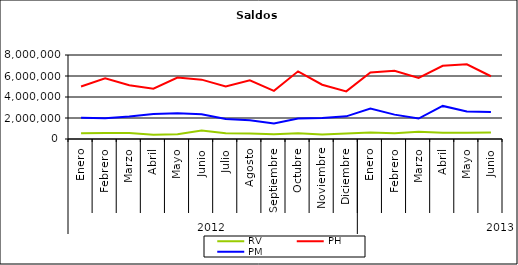
| Category | RV | PH | PM |
|---|---|---|---|
| 0 | 549778.168 | 5006132.96 | 2027838.04 |
| 1 | 570527.999 | 5771155.703 | 1979807.811 |
| 2 | 560604.832 | 5123876.98 | 2144060.858 |
| 3 | 406794.423 | 4795437.398 | 2380409.171 |
| 4 | 462649.26 | 5850616.083 | 2461213.349 |
| 5 | 809983.459 | 5653357.045 | 2353480.477 |
| 6 | 546190.07 | 4994057.097 | 1898309.443 |
| 7 | 522567.991 | 5588479.785 | 1784429.37 |
| 8 | 448289.909 | 4586134.432 | 1485313.653 |
| 9 | 545363.306 | 6443891.409 | 1946986.634 |
| 10 | 423789.041 | 5166977.96 | 1999930.741 |
| 11 | 520855.606 | 4534308.602 | 2157542.738 |
| 12 | 625726.624 | 6338490.057 | 2894951.851 |
| 13 | 552164.14 | 6505711.807 | 2320902.81 |
| 14 | 684317.675 | 5822855.149 | 1948127.804 |
| 15 | 601474.166 | 6976391.987 | 3151453.143 |
| 16 | 590050.657 | 7107878.906 | 2620515.735 |
| 17 | 624993.58 | 5975534.656 | 2574055.31 |